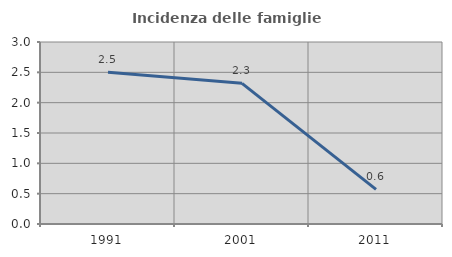
| Category | Incidenza delle famiglie numerose |
|---|---|
| 1991.0 | 2.5 |
| 2001.0 | 2.319 |
| 2011.0 | 0.571 |